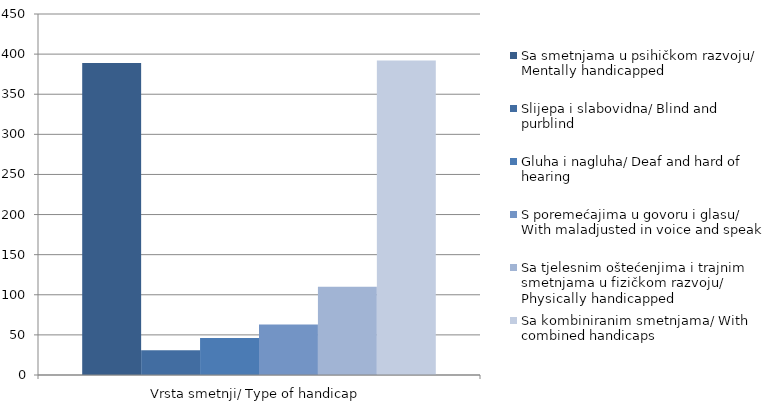
| Category | Sa smetnjama u psihičkom razvoju/ Mentally handicapped  | Slijepa i slabovidna/ Blind and purblind | Gluha i nagluha/ Deaf and hard of hearing | S poremećajima u govoru i glasu/ With maladjusted in voice and speak | Sa tjelesnim oštećenjima i trajnim smetnjama u fizičkom razvoju/ Physically handicapped | Sa kombiniranim smetnjama/ With combined handicaps |
|---|---|---|---|---|---|---|
| 0 | 389 | 31 | 46 | 63 | 110 | 392 |